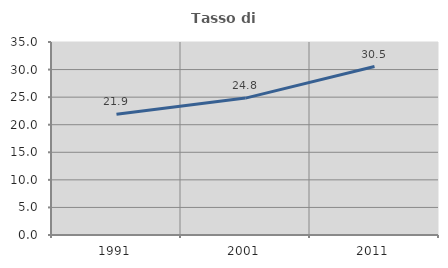
| Category | Tasso di occupazione   |
|---|---|
| 1991.0 | 21.915 |
| 2001.0 | 24.824 |
| 2011.0 | 30.546 |